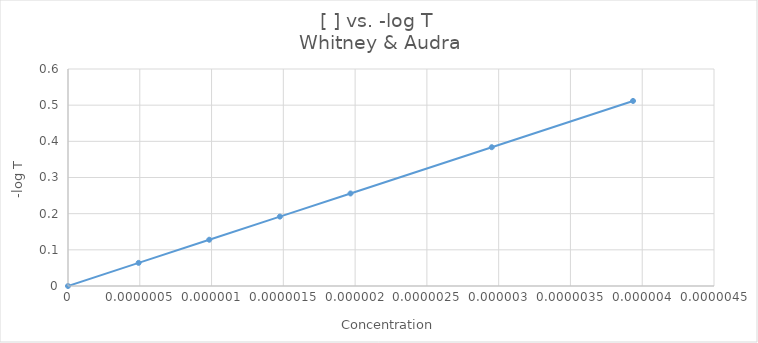
| Category | Series 0 |
|---|---|
| 3.936e-06 | 0.512 |
| 2.952e-06 | 0.384 |
| 1.968e-06 | 0.256 |
| 1.476e-06 | 0.192 |
| 9.84e-07 | 0.128 |
| 4.92e-07 | 0.064 |
| 0.0 | 0 |